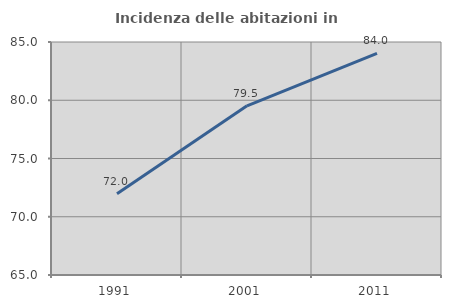
| Category | Incidenza delle abitazioni in proprietà  |
|---|---|
| 1991.0 | 71.979 |
| 2001.0 | 79.523 |
| 2011.0 | 84.022 |